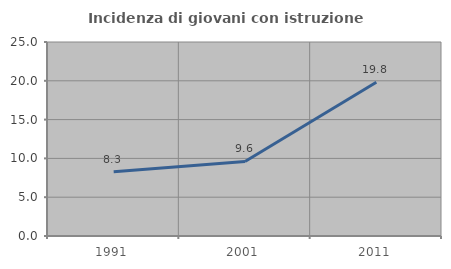
| Category | Incidenza di giovani con istruzione universitaria |
|---|---|
| 1991.0 | 8.272 |
| 2001.0 | 9.603 |
| 2011.0 | 19.806 |